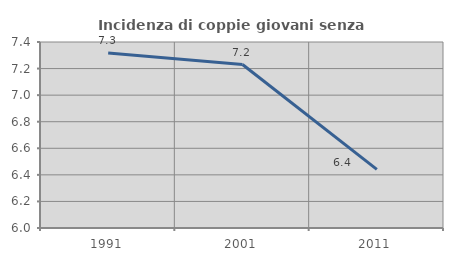
| Category | Incidenza di coppie giovani senza figli |
|---|---|
| 1991.0 | 7.317 |
| 2001.0 | 7.23 |
| 2011.0 | 6.442 |